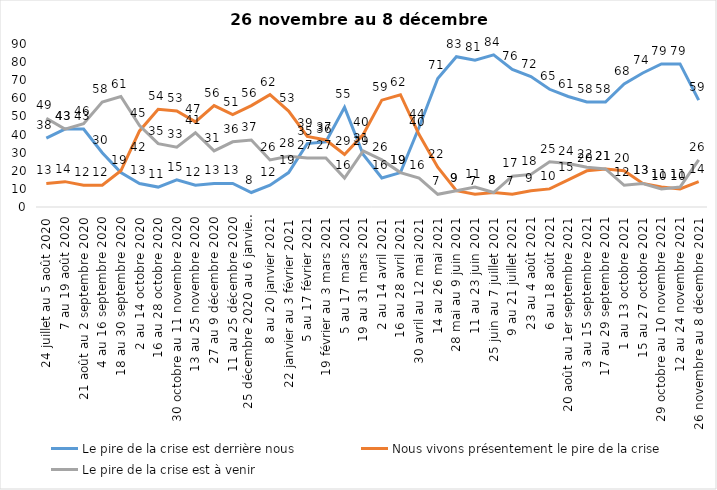
| Category | Le pire de la crise est derrière nous | Nous vivons présentement le pire de la crise | Le pire de la crise est à venir |
|---|---|---|---|
| 24 juillet au 5 août 2020 | 38 | 13 | 49 |
| 7 au 19 août 2020 | 43 | 14 | 43 |
| 21 août au 2 septembre 2020 | 43 | 12 | 46 |
| 4 au 16 septembre 2020 | 30 | 12 | 58 |
| 18 au 30 septembre 2020 | 19 | 20 | 61 |
| 2 au 14 octobre 2020 | 13 | 42 | 45 |
| 16 au 28 octobre 2020 | 11 | 54 | 35 |
| 30 octobre au 11 novembre 2020 | 15 | 53 | 33 |
| 13 au 25 novembre 2020 | 12 | 47 | 41 |
| 27 au 9 décembre 2020 | 13 | 56 | 31 |
| 11 au 25 décembre 2020 | 13 | 51 | 36 |
| 25 décembre 2020 au 6 janvier 2021 | 8 | 56 | 37 |
| 8 au 20 janvier 2021 | 12 | 62 | 26 |
| 22 janvier au 3 février 2021 | 19 | 53 | 28 |
| 5 au 17 février 2021 | 35 | 39 | 27 |
| 19 février au 3 mars 2021 | 36 | 37 | 27 |
| 5 au 17 mars 2021 | 55 | 29 | 16 |
| 19 au 31 mars 2021 | 29 | 40 | 31 |
| 2 au 14 avril 2021 | 16 | 59 | 26 |
| 16 au 28 avril 2021 | 19 | 62 | 19 |
| 30 avril au 12 mai 2021 | 44 | 40 | 16 |
| 14 au 26 mai 2021 | 71 | 22 | 7 |
| 28 mai au 9 juin 2021 | 83 | 9 | 9 |
| 11 au 23 juin 2021 | 81 | 7 | 11 |
| 25 juin au 7 juillet 2021 | 84 | 8 | 8 |
| 9 au 21 juillet 2021 | 76 | 7 | 17 |
| 23 au 4 août 2021 | 72 | 9 | 18 |
| 6 au 18 août 2021 | 65 | 10 | 25 |
| 20 août au 1er septembre 2021 | 61 | 15 | 24 |
| 3 au 15 septembre 2021 | 58 | 20 | 22 |
| 17 au 29 septembre 2021 | 58 | 21 | 21 |
| 1 au 13 octobre 2021 | 68 | 20 | 12 |
| 15 au 27 octobre 2021 | 74 | 13 | 13 |
| 29 octobre au 10 novembre 2021 | 79 | 11 | 10 |
| 12 au 24 novembre 2021 | 79 | 10 | 11 |
| 26 novembre au 8 décembre 2021 | 59 | 14 | 26 |